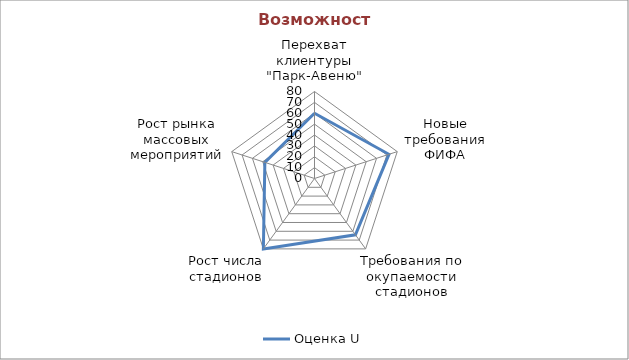
| Category | Оценка U |
|---|---|
| Перехват клиентуры "Парк-Авеню" | 60 |
| Новые требования ФИФА | 72 |
| Требования по окупаемости стадионов | 64 |
| Рост числа стадионов | 80 |
| Рост рынка массовых мероприятий | 48 |